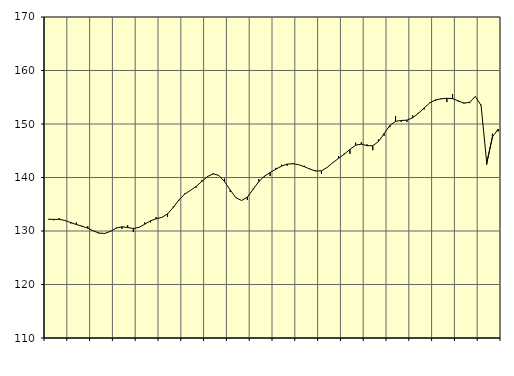
| Category | Piggar | Samtliga sysselsatta (inkl. sysselsatta utomlands) |
|---|---|---|
| nan | 132.2 | 132.2 |
| 1.0 | 132 | 132.17 |
| 1.0 | 132.4 | 132.18 |
| 1.0 | 132 | 131.97 |
| nan | 131.4 | 131.58 |
| 2.0 | 131.6 | 131.21 |
| 2.0 | 130.8 | 130.91 |
| 2.0 | 130.9 | 130.52 |
| nan | 130 | 130.01 |
| 3.0 | 129.5 | 129.62 |
| 3.0 | 129.6 | 129.55 |
| 3.0 | 130 | 129.95 |
| nan | 130.6 | 130.53 |
| 4.0 | 130.4 | 130.79 |
| 4.0 | 131.1 | 130.65 |
| 4.0 | 129.8 | 130.47 |
| nan | 130.7 | 130.69 |
| 5.0 | 131.6 | 131.27 |
| 5.0 | 131.6 | 131.91 |
| 5.0 | 132.6 | 132.28 |
| nan | 132.6 | 132.55 |
| 6.0 | 132.6 | 133.19 |
| 6.0 | 134.6 | 134.4 |
| 6.0 | 135.7 | 135.82 |
| nan | 137 | 136.88 |
| 7.0 | 137.6 | 137.59 |
| 7.0 | 138.1 | 138.31 |
| 7.0 | 139.5 | 139.25 |
| nan | 140.1 | 140.17 |
| 8.0 | 140.8 | 140.68 |
| 8.0 | 140.4 | 140.38 |
| 8.0 | 139.8 | 139.24 |
| nan | 137.3 | 137.66 |
| 9.0 | 136.2 | 136.21 |
| 9.0 | 135.7 | 135.7 |
| 9.0 | 135.8 | 136.33 |
| nan | 137.9 | 137.77 |
| 10.0 | 139.7 | 139.24 |
| 10.0 | 140.1 | 140.25 |
| 10.0 | 140.3 | 140.94 |
| nan | 141.8 | 141.55 |
| 11.0 | 142.4 | 142.14 |
| 11.0 | 142.2 | 142.51 |
| 11.0 | 142.7 | 142.57 |
| nan | 142.4 | 142.39 |
| 12.0 | 142.2 | 142.02 |
| 12.0 | 141.6 | 141.57 |
| 12.0 | 141.3 | 141.2 |
| nan | 140.7 | 141.25 |
| 13.0 | 141.9 | 141.88 |
| 13.0 | 142.8 | 142.77 |
| 13.0 | 144 | 143.58 |
| nan | 144.5 | 144.36 |
| 14.0 | 144.4 | 145.24 |
| 14.0 | 146.5 | 146.04 |
| 14.0 | 146.6 | 146.23 |
| nan | 146.2 | 145.95 |
| 15.0 | 145.1 | 145.93 |
| 15.0 | 147.1 | 146.72 |
| 15.0 | 147.8 | 148.21 |
| nan | 149.4 | 149.72 |
| 16.0 | 151.5 | 150.5 |
| 16.0 | 150.4 | 150.66 |
| 16.0 | 150.4 | 150.72 |
| nan | 151.6 | 151.16 |
| 17.0 | 152.1 | 151.99 |
| 17.0 | 152.7 | 152.99 |
| 17.0 | 154 | 153.94 |
| nan | 154.3 | 154.5 |
| 18.0 | 154.8 | 154.7 |
| 18.0 | 154.1 | 154.81 |
| 18.0 | 155.6 | 154.74 |
| nan | 154.2 | 154.33 |
| 19.0 | 154 | 153.88 |
| 19.0 | 153.9 | 154.08 |
| 19.0 | 155.1 | 155.14 |
| nan | 153.6 | 153.48 |
| 20.0 | 142.4 | 142.69 |
| 20.0 | 148.2 | 147.59 |
| 20.0 | 148.6 | 149.05 |